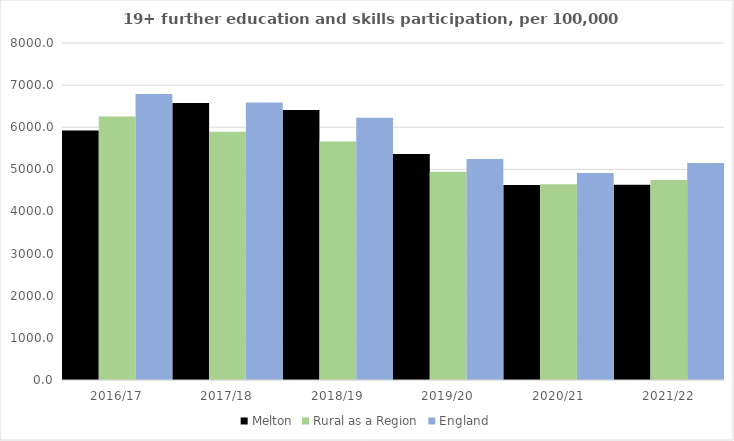
| Category | Melton | Rural as a Region | England |
|---|---|---|---|
| 2016/17 | 5920 | 6253.401 | 6788 |
| 2017/18 | 6575 | 5892.029 | 6588 |
| 2018/19 | 6411 | 5661.873 | 6227 |
| 2019/20 | 5364 | 4943.801 | 5244 |
| 2020/21 | 4629 | 4646.727 | 4913 |
| 2021/22 | 4636 | 4747.049 | 5151 |